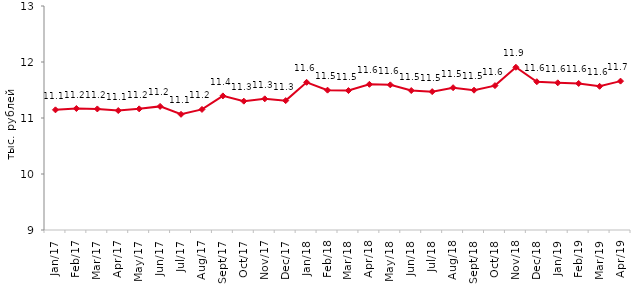
| Category | тыс. руб. |
|---|---|
| 2017-01-01 | 11.146 |
| 2017-02-01 | 11.17 |
| 2017-03-01 | 11.162 |
| 2017-04-01 | 11.133 |
| 2017-05-01 | 11.163 |
| 2017-06-01 | 11.207 |
| 2017-07-01 | 11.066 |
| 2017-08-01 | 11.153 |
| 2017-09-01 | 11.395 |
| 2017-10-01 | 11.301 |
| 2017-11-01 | 11.342 |
| 2017-12-01 | 11.31 |
| 2018-01-01 | 11.637 |
| 2018-02-01 | 11.497 |
| 2018-03-01 | 11.49 |
| 2018-04-01 | 11.601 |
| 2018-05-01 | 11.592 |
| 2018-06-01 | 11.491 |
| 2018-07-01 | 11.471 |
| 2018-08-01 | 11.541 |
| 2018-09-01 | 11.497 |
| 2018-10-01 | 11.578 |
| 2018-11-01 | 11.906 |
| 2018-12-01 | 11.648 |
| 2019-01-01 | 11.629 |
| 2019-02-01 | 11.617 |
| 2019-03-01 | 11.566 |
| 2019-04-01 | 11.659 |